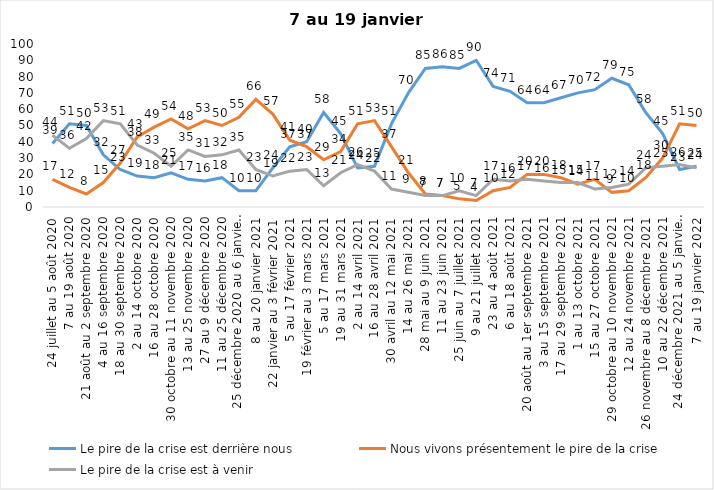
| Category | Le pire de la crise est derrière nous | Nous vivons présentement le pire de la crise | Le pire de la crise est à venir |
|---|---|---|---|
| 24 juillet au 5 août 2020 | 39 | 17 | 44 |
| 7 au 19 août 2020 | 51 | 12 | 36 |
| 21 août au 2 septembre 2020 | 50 | 8 | 42 |
| 4 au 16 septembre 2020 | 32 | 15 | 53 |
| 18 au 30 septembre 2020 | 23 | 27 | 51 |
| 2 au 14 octobre 2020 | 19 | 43 | 38 |
| 16 au 28 octobre 2020 | 18 | 49 | 33 |
| 30 octobre au 11 novembre 2020 | 21 | 54 | 25 |
| 13 au 25 novembre 2020 | 17 | 48 | 35 |
| 27 au 9 décembre 2020 | 16 | 53 | 31 |
| 11 au 25 décembre 2020 | 18 | 50 | 32 |
| 25 décembre 2020 au 6 janvier 2021 | 10 | 55 | 35 |
| 8 au 20 janvier 2021 | 10 | 66 | 23 |
| 22 janvier au 3 février 2021 | 24 | 57 | 19 |
| 5 au 17 février 2021 | 37 | 41 | 22 |
| 19 février au 3 mars 2021 | 40 | 37 | 23 |
| 5 au 17 mars 2021 | 58 | 29 | 13 |
| 19 au 31 mars 2021 | 45 | 34 | 21 |
| 2 au 14 avril 2021 | 24 | 51 | 26 |
| 16 au 28 avril 2021 | 25 | 53 | 22 |
| 30 avril au 12 mai 2021 | 51 | 37 | 11 |
| 14 au 26 mai 2021 | 70 | 21 | 9 |
| 28 mai au 9 juin 2021 | 85 | 8 | 7 |
| 11 au 23 juin 2021 | 86 | 7 | 7 |
| 25 juin au 7 juillet 2021 | 85 | 5 | 10 |
| 9 au 21 juillet 2021 | 90 | 4 | 7 |
| 23 au 4 août 2021 | 74 | 10 | 17 |
| 6 au 18 août 2021 | 71 | 12 | 16 |
| 20 août au 1er septembre 2021 | 64 | 20 | 17 |
| 3 au 15 septembre 2021 | 64 | 20 | 16 |
| 17 au 29 septembre 2021 | 67 | 18 | 15 |
| 1 au 13 octobre 2021 | 70 | 14 | 15 |
| 15 au 27 octobre 2021 | 72 | 17 | 11 |
| 29 octobre au 10 novembre 2021 | 79 | 9 | 12 |
| 12 au 24 novembre 2021 | 75 | 10 | 14 |
| 26 novembre au 8 décembre 2021 | 58 | 18 | 24 |
| 10 au 22 décembre 2021 | 45 | 30 | 25 |
| 24 décembre 2021 au 5 janvier 2022 2022 | 23 | 51 | 26 |
| 7 au 19 janvier 2022 | 25 | 50 | 24 |